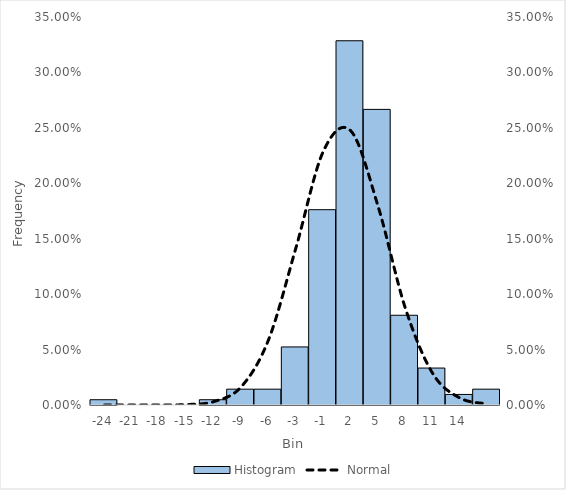
| Category | Histogram |
|---|---|
| -24.15000270980538 | 0.005 |
| -21.19980533666233 | 0 |
| -18.24960796351928 | 0 |
| -15.29941059037623 | 0 |
| -12.34921321723318 | 0.005 |
| -9.399015844090133 | 0.014 |
| -6.448818470947081 | 0.014 |
| -3.498621097804033 | 0.052 |
| -0.548423724660982 | 0.176 |
| 2.40177364848207 | 0.329 |
| 5.351971021625118 | 0.267 |
| 8.302168394768167 | 0.081 |
| 11.25236576791122 | 0.033 |
| 14.20256314105427 | 0.01 |